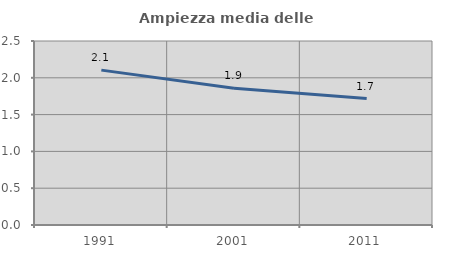
| Category | Ampiezza media delle famiglie |
|---|---|
| 1991.0 | 2.104 |
| 2001.0 | 1.858 |
| 2011.0 | 1.718 |